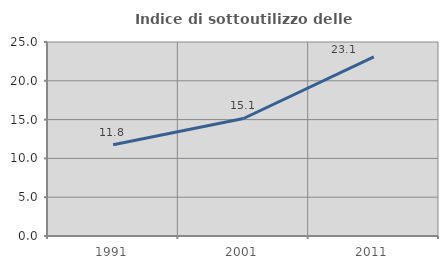
| Category | Indice di sottoutilizzo delle abitazioni  |
|---|---|
| 1991.0 | 11.765 |
| 2001.0 | 15.144 |
| 2011.0 | 23.077 |